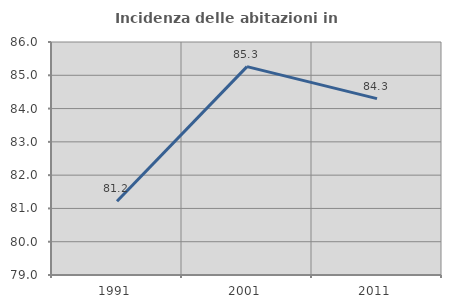
| Category | Incidenza delle abitazioni in proprietà  |
|---|---|
| 1991.0 | 81.215 |
| 2001.0 | 85.26 |
| 2011.0 | 84.299 |